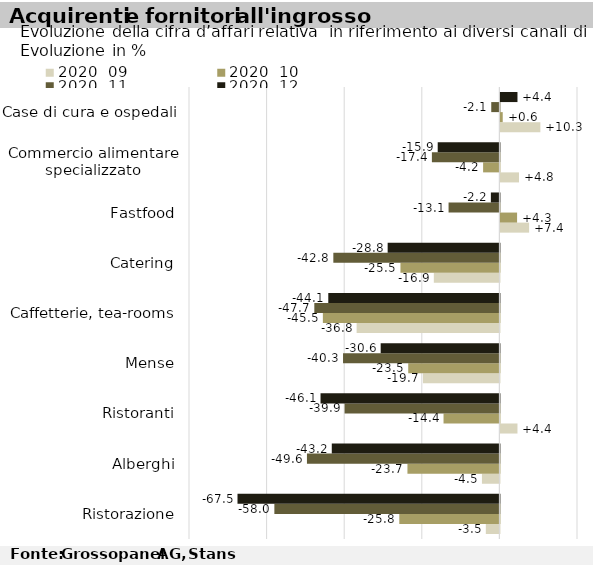
| Category | 2020  |
|---|---|
| Ristorazione | -67.5 |
| Alberghi | -43.2 |
| Ristoranti | -46.1 |
| Mense | -30.6 |
| Caffetterie, tea-rooms | -44.1 |
| Catering | -28.8 |
| Fastfood | -2.2 |
| Commercio alimentare specializzato | -15.9 |
| Case di cura e ospedali | 4.4 |